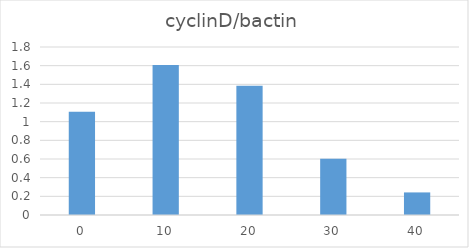
| Category | cyclinD/bactin |
|---|---|
| 0.0 | 1.107 |
| 10.0 | 1.608 |
| 20.0 | 1.384 |
| 30.0 | 0.603 |
| 40.0 | 0.242 |